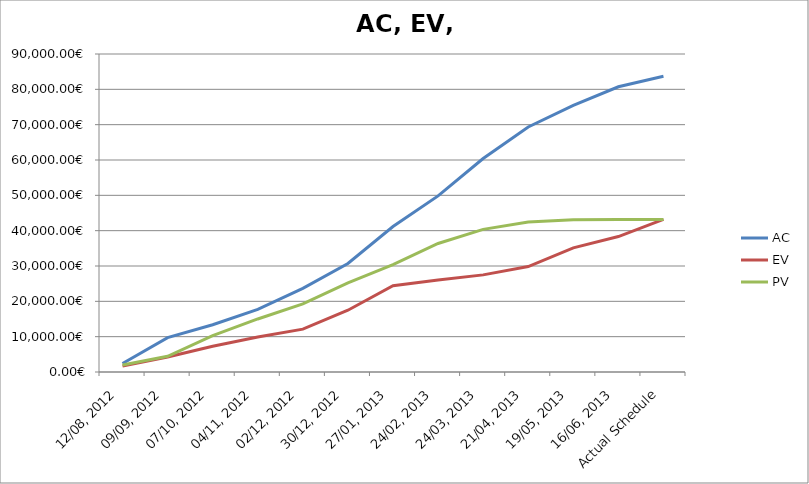
| Category | AC | EV | PV |
|---|---|---|---|
| 12/08, 2012 | 2400 | 1704 | 1995 |
| 09/09, 2012 | 9720 | 4239 | 4437 |
| 07/10, 2012 | 13362 | 7302.231 | 10323 |
| 04/11, 2012 | 17697 | 9925.429 | 15013.2 |
| 02/12, 2012 | 23667 | 12139.7 | 19272.15 |
| 30/12, 2012 | 30717 | 17491.98 | 25239.3 |
| 27/01, 2013 | 41175 | 24416.603 | 30408.15 |
| 24/02, 2013 | 49833 | 26046.063 | 36378.15 |
| 24/03, 2013 | 60408 | 27485.336 | 40363.8 |
| 21/04, 2013 | 69336 | 29838.265 | 42432.15 |
| 19/05, 2013 | 75447 | 35149.411 | 43071.15 |
| 16/06, 2013 | 80721 | 38328.689 | 43170.15 |
| Actual Schedule | 83712.15 | 43170.15 | 43170.15 |